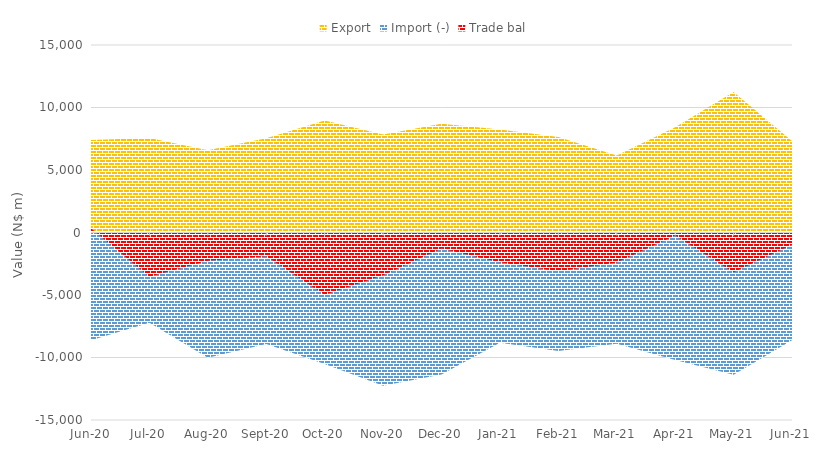
| Category | Export | Import (-) | Trade bal |
|---|---|---|---|
| 2020-06-01 | 7405.105 | -8613.251 | 337.622 |
| 2020-07-01 | 7563.622 | -7226.017 | -3547.852 |
| 2020-08-01 | 6582.778 | -10011.133 | -2266.332 |
| 2020-09-01 | 7530.921 | -8929.009 | -1896.548 |
| 2020-10-01 | 8956.343 | -10517.505 | -4976.932 |
| 2020-11-01 | 7841.654 | -12260.917 | -3421.411 |
| 2020-12-01 | 8693.096 | -11362.05 | -1289.324 |
| 2021-01-01 | 8235.884 | -8822.411 | -2372.976 |
| 2021-02-01 | 7635.601 | -9480.493 | -3101.515 |
| 2021-03-01 | 6167.708 | -8905.157 | -2394.897 |
| 2021-04-01 | 8414.513 | -10200.123 | -249.001 |
| 2021-05-01 | 11240.509 | -11383.894 | -3184 |
| 2021-06-01 | 7313.471 | -8627.851 | -987 |